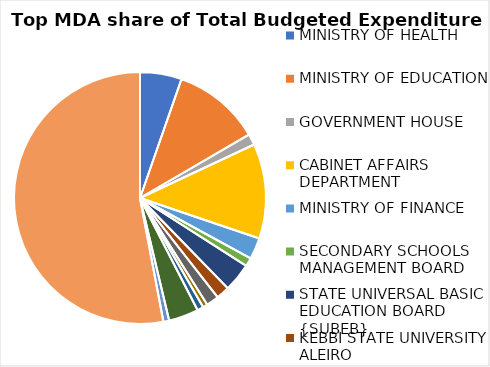
| Category | Percentage of Total Budgeted Expenditure |
|---|---|
| MINISTRY OF HEALTH | 5.344 |
| MINISTRY OF EDUCATION | 11.26 |
| GOVERNMENT HOUSE | 1.421 |
| CABINET AFFAIRS DEPARTMENT | 12.181 |
| MINISTRY OF FINANCE | 2.747 |
| SECONDARY SCHOOLS MANAGEMENT BOARD | 1.096 |
| STATE UNIVERSAL BASIC EDUCATION BOARD {SUBEB} | 3.674 |
| KEBBI STATE UNIVERSITY ALEIRO | 1.707 |
| STATE HOUSE OF ASSEMBLY | 1.616 |
| MINISTRY OF JUSTICE | 0.603 |
| SHARIA COURT | 0.8 |
| MINISTRY OF HIGHER EDUCATION | 3.834 |
| ADMINISTRATION DEPARTMENT | 0.738 |
| Other MDA Expenditure | 52.978 |